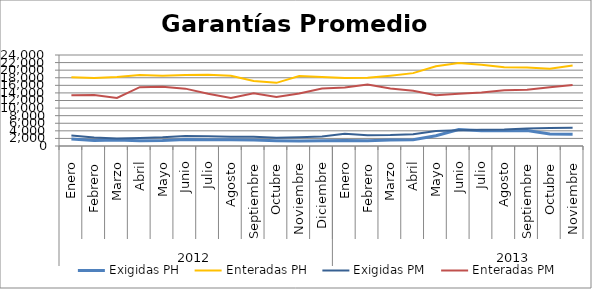
| Category | Exigidas PH | Enteradas PH | Exigidas PM | Enteradas PM |
|---|---|---|---|---|
| 0 | 1828.564 | 18155.583 | 2744.93 | 13413.991 |
| 1 | 1451.155 | 17917.734 | 2215.902 | 13440.832 |
| 2 | 1587.31 | 18166.129 | 1968.766 | 12673.714 |
| 3 | 1353.003 | 18741.256 | 2118.782 | 15515.723 |
| 4 | 1464.668 | 18540.927 | 2278.002 | 15625.393 |
| 5 | 1719.43 | 18734.539 | 2626.915 | 15127.903 |
| 6 | 1674.023 | 18761.463 | 2556.575 | 13766.49 |
| 7 | 1647.243 | 18544.546 | 2463.76 | 12637.427 |
| 8 | 1556.152 | 17124.972 | 2459.803 | 13929.715 |
| 9 | 1402.926 | 16653.067 | 2169.047 | 12937.81 |
| 10 | 1329.011 | 18467.462 | 2322.009 | 13825.53 |
| 11 | 1379.519 | 18204.98 | 2522.413 | 15188.776 |
| 12 | 1462.675 | 17957.148 | 3246.817 | 15415.235 |
| 13 | 1398.609 | 17993.637 | 2845.352 | 16230.589 |
| 14 | 1589.589 | 18548.479 | 2894.834 | 15192.36 |
| 15 | 1623.519 | 19220.98 | 3086.854 | 14555.102 |
| 16 | 2700.009 | 21053.59 | 3968.296 | 13386.678 |
| 17 | 4335.591 | 21872.028 | 4126.324 | 13759.513 |
| 18 | 4053.78 | 21401.693 | 4283.155 | 14110.316 |
| 19 | 4016.859 | 20783.858 | 4341.698 | 14691.614 |
| 20 | 4109.679 | 20689.944 | 4647.813 | 14857.936 |
| 21 | 3158.931 | 20386.396 | 4756.737 | 15467.175 |
| 22 | 3080.721 | 21200.312 | 4793.633 | 16095.042 |